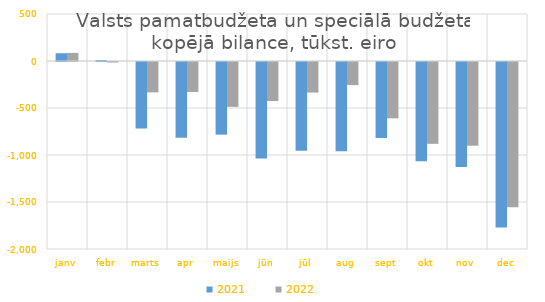
| Category | 2021 | 2022 |
|---|---|---|
| janv | 82687.376 | 85977.566 |
| febr | 10789.506 | -5472.016 |
| marts | -707667.142 | -323198.32 |
| apr | -805934.062 | -318736.122 |
| maijs | -772767.286 | -477330.976 |
| jūn | -1025311.488 | -415131.505 |
| jūl | -945181.179 | -325256.633 |
| aug | -949030.982 | -245672.594 |
| sept | -808331.47 | -599017.929 |
| okt | -1054736.124 | -870438.915 |
| nov | -1116758.714 | -890453.865 |
| dec | -1760352.308 | -1545721.851 |